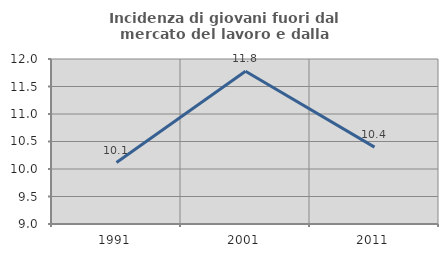
| Category | Incidenza di giovani fuori dal mercato del lavoro e dalla formazione  |
|---|---|
| 1991.0 | 10.117 |
| 2001.0 | 11.776 |
| 2011.0 | 10.398 |